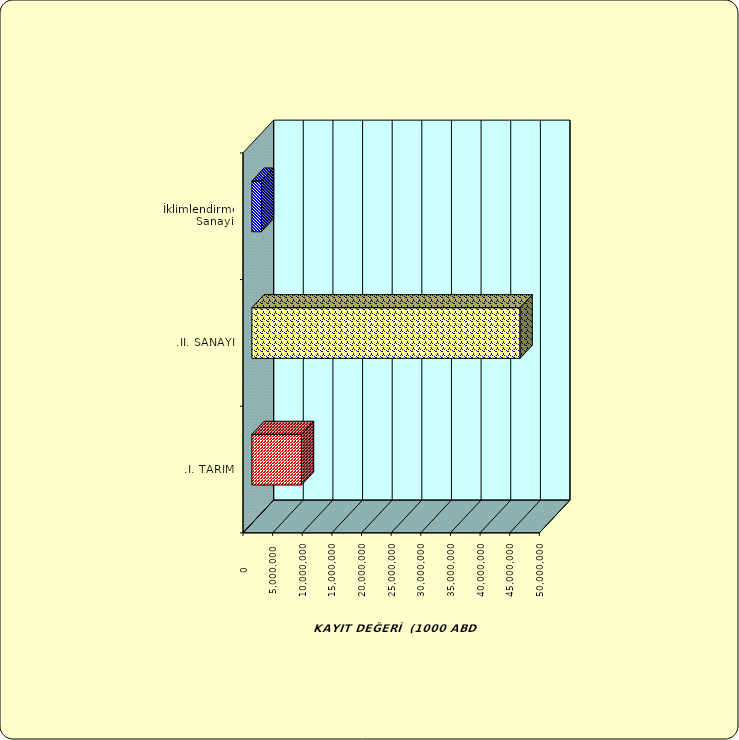
| Category | Series 0 |
|---|---|
| .I. TARIM | 8374518.073 |
| .II. SANAYİ | 45247176.233 |
|  İklimlendirme Sanayii | 1613758.918 |